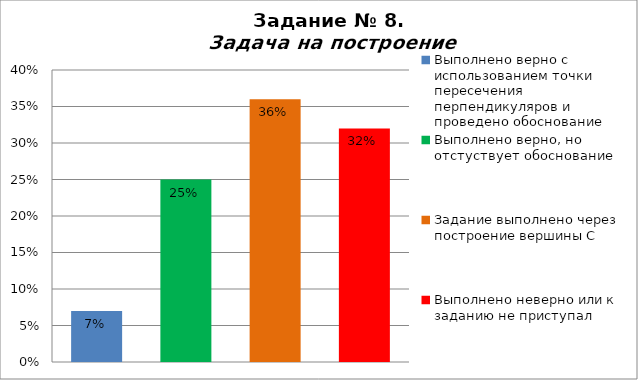
| Category | Задача на построение |
|---|---|
| Выполнено верно с использованием точки пересечения перпендикуляров и проведено обоснование | 0.07 |
| Выполнено верно, но отстуствует обоснование | 0.25 |
| Задание выполнено через построение вершины С | 0.36 |
| Выполнено неверно или к заданию не приступал | 0.32 |